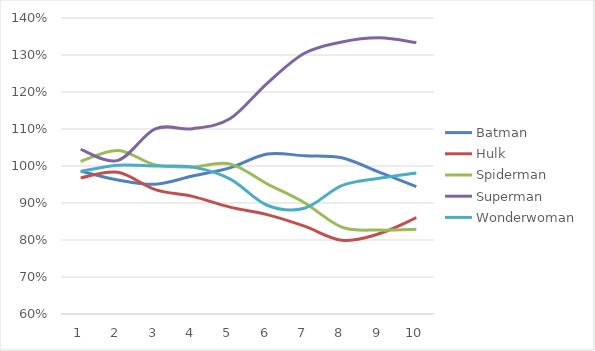
| Category | Batman | Hulk | Spiderman | Superman | Wonderwoman |
|---|---|---|---|---|---|
| 1.0 | 0.986 | 0.968 | 1.012 | 1.045 | 0.985 |
| 2.0 | 0.962 | 0.983 | 1.042 | 1.015 | 1.002 |
| 3.0 | 0.951 | 0.936 | 1.003 | 1.1 | 1 |
| 4.0 | 0.973 | 0.918 | 0.997 | 1.101 | 0.997 |
| 5.0 | 0.995 | 0.889 | 1.006 | 1.128 | 0.965 |
| 6.0 | 1.032 | 0.869 | 0.952 | 1.224 | 0.894 |
| 7.0 | 1.028 | 0.837 | 0.901 | 1.305 | 0.886 |
| 8.0 | 1.022 | 0.799 | 0.835 | 1.335 | 0.947 |
| 9.0 | 0.983 | 0.817 | 0.827 | 1.347 | 0.967 |
| 10.0 | 0.944 | 0.86 | 0.829 | 1.334 | 0.981 |